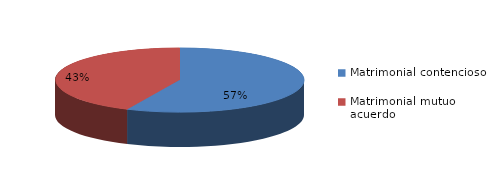
| Category | Series 0 |
|---|---|
| 0 | 575 |
| 1 | 436 |